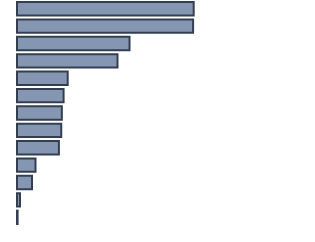
| Category | Percentatge |
|---|---|
| 0 | 60.3 |
| 1 | 60.1 |
| 2 | 38.4 |
| 3 | 34.3 |
| 4 | 17.3 |
| 5 | 15.9 |
| 6 | 15.3 |
| 7 | 15.1 |
| 8 | 14.3 |
| 9 | 6.3 |
| 10 | 5.1 |
| 11 | 1 |
| 12 | 0.2 |